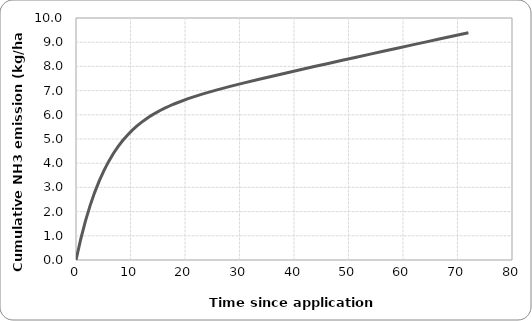
| Category | Series 0 |
|---|---|
| 0.0 | 0 |
| 0.8571428571428571 | 0.855 |
| 1.7142857142857142 | 1.595 |
| 2.571428571428571 | 2.238 |
| 3.4285714285714284 | 2.796 |
| 4.285714285714286 | 3.282 |
| 5.142857142857142 | 3.706 |
| 6.0 | 4.076 |
| 6.857142857142857 | 4.4 |
| 7.7142857142857135 | 4.685 |
| 8.571428571428571 | 4.936 |
| 9.428571428571429 | 5.158 |
| 10.285714285714285 | 5.355 |
| 11.142857142857142 | 5.53 |
| 12.0 | 5.687 |
| 12.857142857142856 | 5.828 |
| 13.714285714285714 | 5.956 |
| 14.571428571428571 | 6.072 |
| 15.428571428571427 | 6.177 |
| 16.285714285714285 | 6.274 |
| 17.142857142857142 | 6.364 |
| 18.0 | 6.447 |
| 20.571428571428573 | 6.666 |
| 23.142857142857142 | 6.854 |
| 25.714285714285715 | 7.021 |
| 28.285714285714285 | 7.175 |
| 30.857142857142858 | 7.32 |
| 33.42857142857143 | 7.46 |
| 36.0 | 7.596 |
| 38.57142857142857 | 7.73 |
| 41.142857142857146 | 7.862 |
| 43.714285714285715 | 7.992 |
| 46.28571428571429 | 8.122 |
| 48.85714285714286 | 8.251 |
| 51.42857142857143 | 8.38 |
| 54.0 | 8.508 |
| 56.57142857142858 | 8.635 |
| 59.142857142857146 | 8.762 |
| 61.714285714285715 | 8.889 |
| 64.28571428571429 | 9.015 |
| 66.85714285714286 | 9.14 |
| 69.42857142857143 | 9.266 |
| 72.0 | 9.39 |